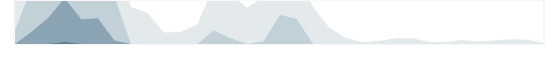
| Category | Производство | Series 1 | Series 2 | Series 3 |
|---|---|---|---|---|
| 0.333333333333333 | 979 | 229 | 0 | 0 |
| nan | 1708 | 958 | 208 | 0 |
| nan | 1943 | 1193 | 443 | 0 |
| nan | 2282 | 1532 | 782 | 32 |
| 0.416666666666667 | 1920 | 1170 | 420 | 0 |
| nan | 1940 | 1190 | 440 | 0 |
| nan | 1559 | 809 | 59 | 0 |
| nan | 625 | 0 | 0 | 0 |
| 0.5 | 531 | 0 | 0 | 0 |
| nan | 198 | 0 | 0 | 0 |
| nan | 203 | 0 | 0 | 0 |
| nan | 332 | 0 | 0 | 0 |
| 0.583333333333333 | 979 | 229 | 0 | 0 |
| nan | 854 | 104 | 0 | 0 |
| nan | 617 | 0 | 0 | 0 |
| nan | 793 | 43 | 0 | 0 |
| 0.666666666666667 | 1248 | 498 | 0 | 0 |
| nan | 1176 | 426 | 0 | 0 |
| nan | 624 | 0 | 0 | 0 |
| nan | 273 | 0 | 0 | 0 |
| 0.75 | 98 | 0 | 0 | 0 |
| nan | 30 | 0 | 0 | 0 |
| nan | 50 | 0 | 0 | 0 |
| nan | 99 | 0 | 0 | 0 |
| 0.833333333333333 | 97 | 0 | 0 | 0 |
| nan | 33 | 0 | 0 | 0 |
| nan | 40 | 0 | 0 | 0 |
| nan | 69 | 0 | 0 | 0 |
| 0.916666666666667 | 41 | 0 | 0 | 0 |
| nan | 64 | 0 | 0 | 0 |
| nan | 82 | 0 | 0 | 0 |
| nan | 74 | 0 | 0 | 0 |
| 0.9993055555555556 | 12 | 0 | 0 | 0 |